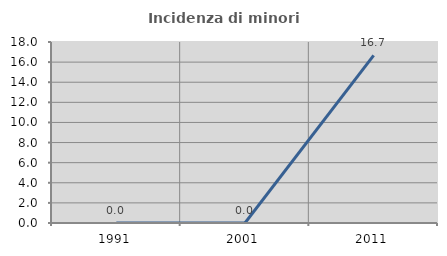
| Category | Incidenza di minori stranieri |
|---|---|
| 1991.0 | 0 |
| 2001.0 | 0 |
| 2011.0 | 16.667 |